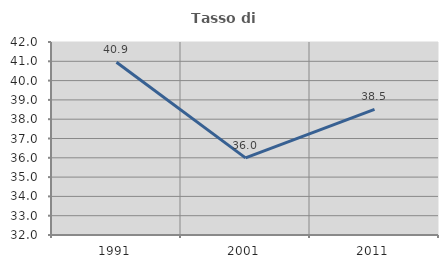
| Category | Tasso di occupazione   |
|---|---|
| 1991.0 | 40.947 |
| 2001.0 | 35.998 |
| 2011.0 | 38.512 |